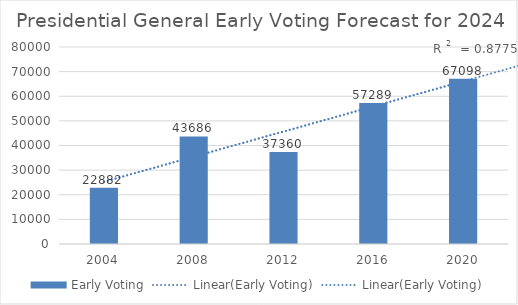
| Category | Early Voting |
|---|---|
| 2004.0 | 22882 |
| 2008.0 | 43686 |
| 2012.0 | 37360 |
| 2016.0 | 57289 |
| 2020.0 | 67098 |